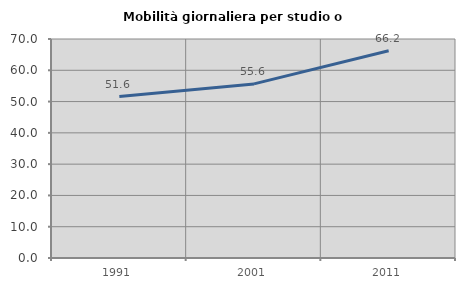
| Category | Mobilità giornaliera per studio o lavoro |
|---|---|
| 1991.0 | 51.605 |
| 2001.0 | 55.643 |
| 2011.0 | 66.224 |